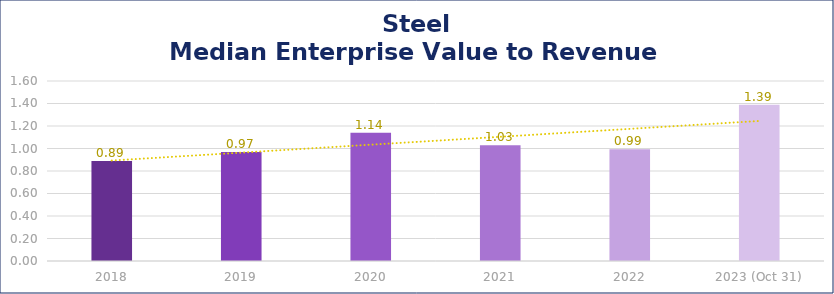
| Category | Steel |
|---|---|
| 2018 | 0.89 |
| 2019 | 0.97 |
| 2020 | 1.14 |
| 2021 | 1.03 |
| 2022 | 0.994 |
| 2023 (Oct 31) | 1.39 |